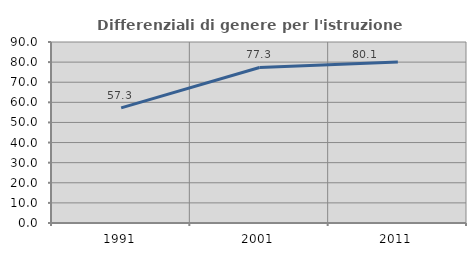
| Category | Differenziali di genere per l'istruzione superiore |
|---|---|
| 1991.0 | 57.253 |
| 2001.0 | 77.321 |
| 2011.0 | 80.058 |